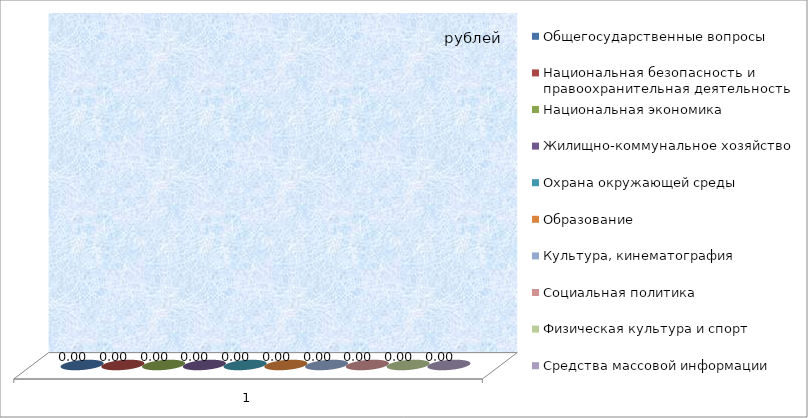
| Category | Общегосударственные вопросы | Национальная безопасность и правоохранительная деятельность | Национальная экономика | Жилищно-коммунальное хозяйство | Охрана окружающей среды | Образование | Культура, кинематография | Социальная политика | Физическая культура и спорт | Средства массовой информации |
|---|---|---|---|---|---|---|---|---|---|---|
| 0 | 0 | 0 | 0 | 0 | 0 | 0 | 0 | 0 | 0 | 0 |